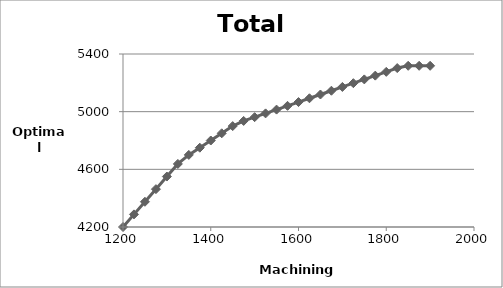
| Category | Objective |
|---|---|
| 1200.0 | 4200 |
| 1225.0 | 4287.5 |
| 1250.0 | 4375 |
| 1275.0 | 4462.5 |
| 1300.0 | 4550 |
| 1325.0 | 4637.5 |
| 1350.0 | 4700 |
| 1375.0 | 4750 |
| 1400.0 | 4800 |
| 1425.0 | 4850 |
| 1450.0 | 4900 |
| 1475.0 | 4935.714 |
| 1500.0 | 4961.905 |
| 1525.0 | 4988.095 |
| 1550.0 | 5014.286 |
| 1575.0 | 5040.476 |
| 1600.0 | 5066.667 |
| 1625.0 | 5092.857 |
| 1650.0 | 5119.048 |
| 1675.0 | 5145.238 |
| 1700.0 | 5171.429 |
| 1725.0 | 5197.619 |
| 1750.0 | 5223.81 |
| 1775.0 | 5250 |
| 1800.0 | 5276.19 |
| 1825.0 | 5302.381 |
| 1850.0 | 5318.095 |
| 1875.0 | 5318.095 |
| 1900.0 | 5318.095 |